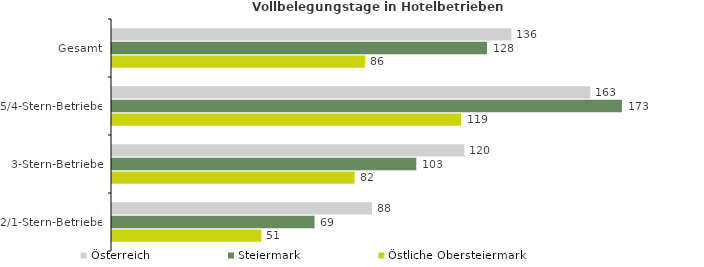
| Category | Österreich | Steiermark | Östliche Obersteiermark |
|---|---|---|---|
| Gesamt | 135.866 | 127.561 | 86.026 |
| 5/4-Stern-Betriebe | 162.683 | 173.435 | 118.739 |
| 3-Stern-Betriebe | 119.851 | 103.499 | 82.492 |
| 2/1-Stern-Betriebe | 88.435 | 68.894 | 50.787 |